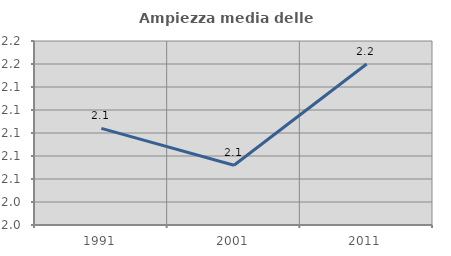
| Category | Ampiezza media delle famiglie |
|---|---|
| 1991.0 | 2.104 |
| 2001.0 | 2.072 |
| 2011.0 | 2.16 |